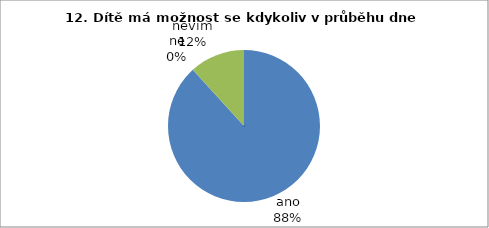
| Category | 12. |
|---|---|
| ano | 30 |
| ne | 0 |
| nevím | 4 |